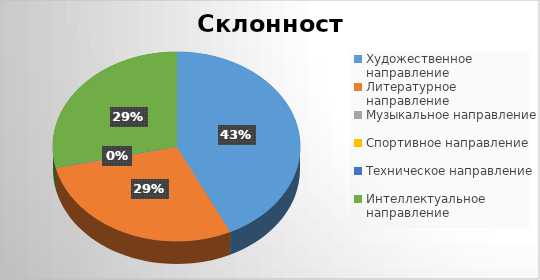
| Category | Series 0 |
|---|---|
| Художественное направление | 3 |
| Литературное направление | 2 |
| Музыкальное направление | 0 |
| Спортивное направление | 0 |
| Техническое направление | 0 |
| Интеллектуальное направление | 2 |